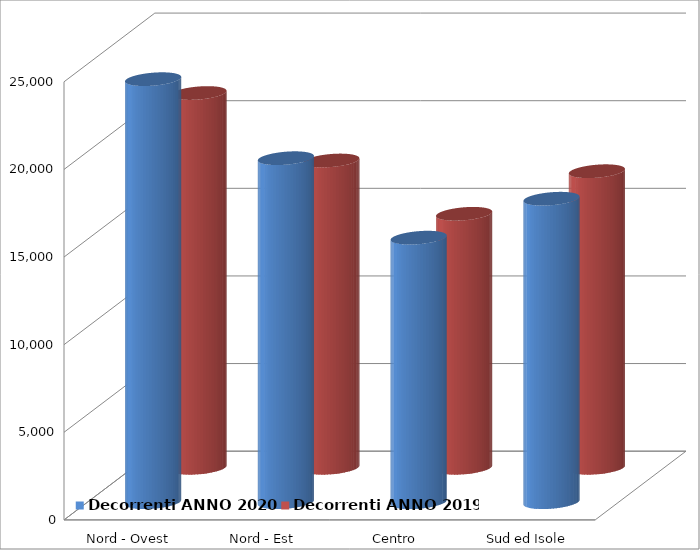
| Category | Decorrenti ANNO 2020 | Decorrenti ANNO 2019 |
|---|---|---|
| Nord - Ovest | 24139 | 21388 |
| Nord - Est | 19630 | 17538 |
| Centro | 15095 | 14496 |
| Sud ed Isole | 17317 | 16926 |